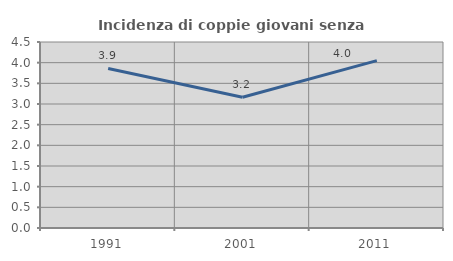
| Category | Incidenza di coppie giovani senza figli |
|---|---|
| 1991.0 | 3.861 |
| 2001.0 | 3.162 |
| 2011.0 | 4.049 |